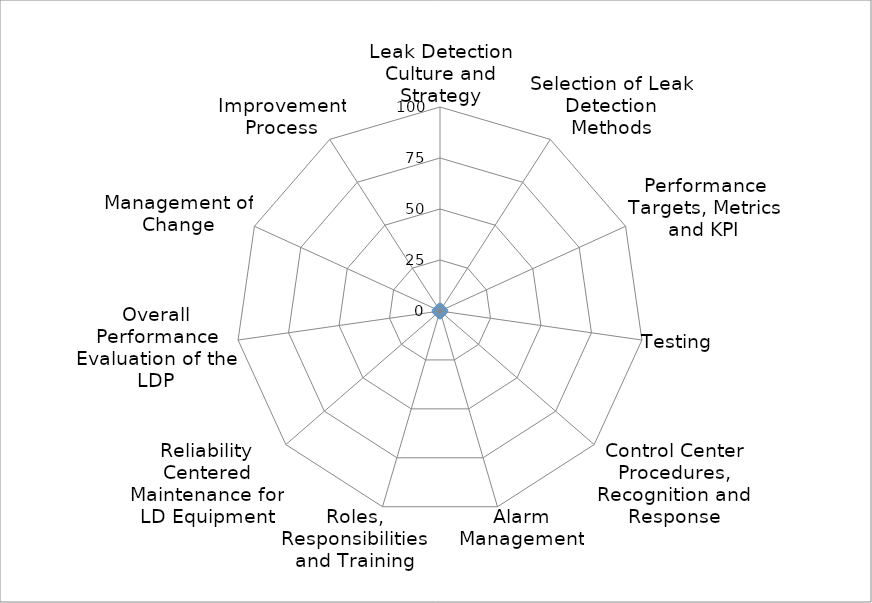
| Category | Series 0 |
|---|---|
| Leak Detection Culture and Strategy | 1 |
| Selection of Leak Detection Methods | 1 |
| Performance Targets, Metrics and KPI | 1 |
| Testing | 1 |
| Control Center Procedures, Recognition and Response | 1 |
| Alarm Management | 1 |
| Roles, Responsibilities and Training | 1 |
| Reliability Centered Maintenance for LD Equipment | 1 |
| Overall Performance Evaluation of the LDP | 1 |
| Management of Change | 1 |
| Improvement Process | 1 |